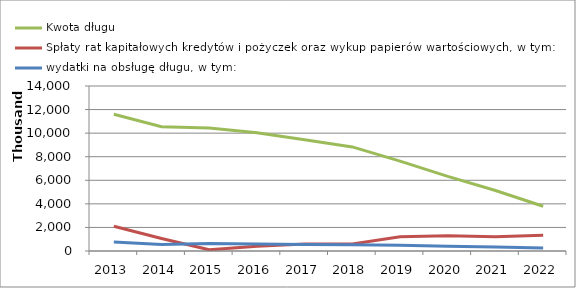
| Category | Kwota długu | Spłaty rat kapitałowych kredytów i pożyczek oraz wykup papierów wartościowych, w tym: | wydatki na obsługę długu, w tym: |
|---|---|---|---|
| 2013.0 | 11607700 | 2105000 | 769690 |
| 2014.0 | 10540850 | 1057000 | 550000 |
| 2015.0 | 10431000 | 100000 | 645000 |
| 2016.0 | 10031000 | 400000 | 600000 |
| 2017.0 | 9431000 | 600000 | 557000 |
| 2018.0 | 8831000 | 600000 | 521000 |
| 2019.0 | 7631000 | 1200000 | 485000 |
| 2020.0 | 6331000 | 1300000 | 413000 |
| 2021.0 | 5131000 | 1200000 | 335000 |
| 2022.0 | 3801000 | 1330000 | 263000 |